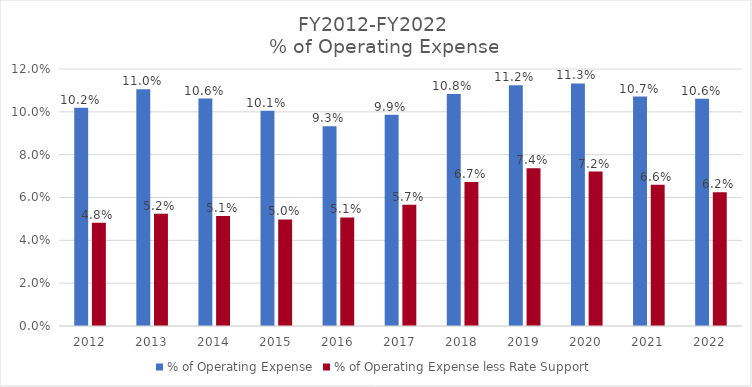
| Category | % of Operating Expense | % of Operating Expense less Rate Support |
|---|---|---|
| 2012.0 | 0.102 | 0.048 |
| 2013.0 | 0.11 | 0.052 |
| 2014.0 | 0.106 | 0.051 |
| 2015.0 | 0.101 | 0.05 |
| 2016.0 | 0.093 | 0.051 |
| 2017.0 | 0.099 | 0.057 |
| 2018.0 | 0.108 | 0.067 |
| 2019.0 | 0.112 | 0.074 |
| 2020.0 | 0.113 | 0.072 |
| 2021.0 | 0.107 | 0.066 |
| 2022.0 | 0.106 | 0.062 |